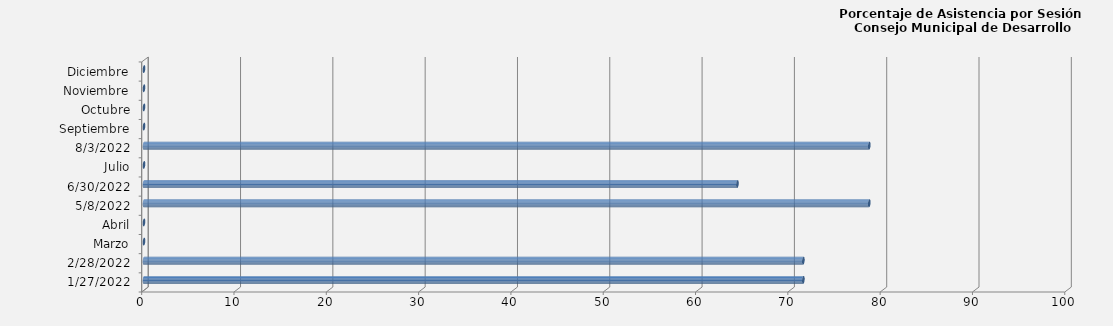
| Category | Series 0 |
|---|---|
| 27/01/2022 | 71.429 |
| 28/02/2022 | 71.429 |
| Marzo | 0 |
| Abril | 0 |
| 08/05/2022 | 78.571 |
| 30/06/2022 | 64.286 |
| Julio | 0 |
| 03/08/2022 | 78.571 |
| Septiembre | 0 |
| Octubre | 0 |
| Noviembre | 0 |
| Diciembre | 0 |